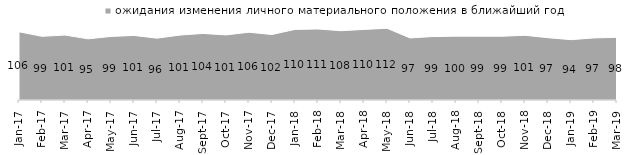
| Category | ожидания изменения личного материального положения в ближайший год |
|---|---|
| 2017-01-01 | 106.3 |
| 2017-02-01 | 99.25 |
| 2017-03-01 | 101.25 |
| 2017-04-01 | 95.3 |
| 2017-05-01 | 99.1 |
| 2017-06-01 | 100.6 |
| 2017-07-01 | 96.4 |
| 2017-08-01 | 101.15 |
| 2017-09-01 | 103.75 |
| 2017-10-01 | 101.45 |
| 2017-11-01 | 105.6 |
| 2017-12-01 | 102.05 |
| 2018-01-01 | 110.05 |
| 2018-02-01 | 110.65 |
| 2018-03-01 | 108 |
| 2018-04-01 | 109.95 |
| 2018-05-01 | 111.8 |
| 2018-06-01 | 96.75 |
| 2018-07-01 | 98.85 |
| 2018-08-01 | 99.5 |
| 2018-09-01 | 99.45 |
| 2018-10-01 | 99.4 |
| 2018-11-01 | 100.848 |
| 2018-12-01 | 97.05 |
| 2019-01-01 | 94.05 |
| 2019-02-01 | 96.75 |
| 2019-03-01 | 97.663 |